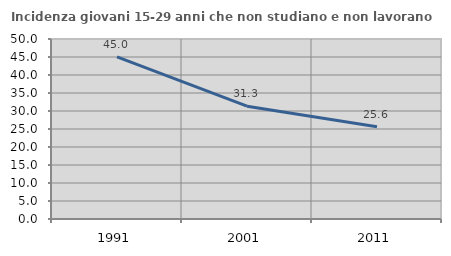
| Category | Incidenza giovani 15-29 anni che non studiano e non lavorano  |
|---|---|
| 1991.0 | 45.029 |
| 2001.0 | 31.348 |
| 2011.0 | 25.639 |